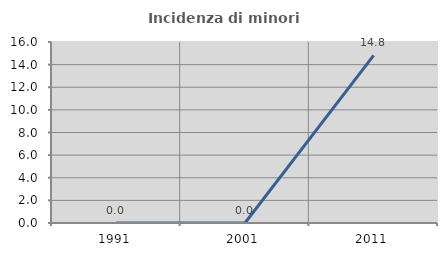
| Category | Incidenza di minori stranieri |
|---|---|
| 1991.0 | 0 |
| 2001.0 | 0 |
| 2011.0 | 14.815 |